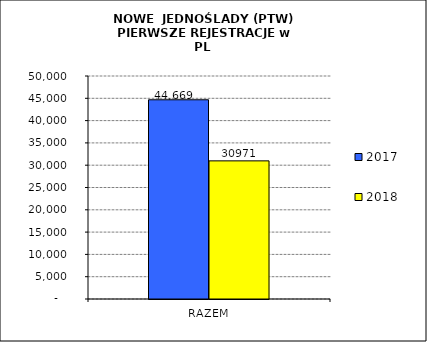
| Category | 2017 | 2018 |
|---|---|---|
| RAZEM | 44669 | 30971 |